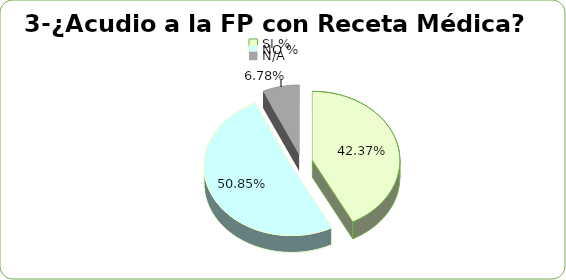
| Category | Series 0 |
|---|---|
| SI % | 0.424 |
| NO % | 0.508 |
| N/A | 0.068 |